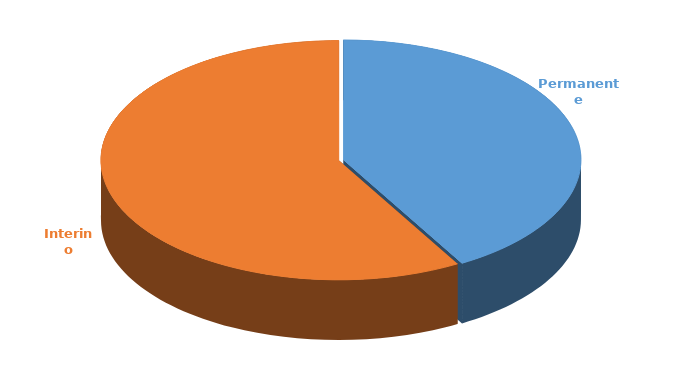
| Category | Cantidad |
|---|---|
| Permanente | 2627 |
| Interino | 3677 |